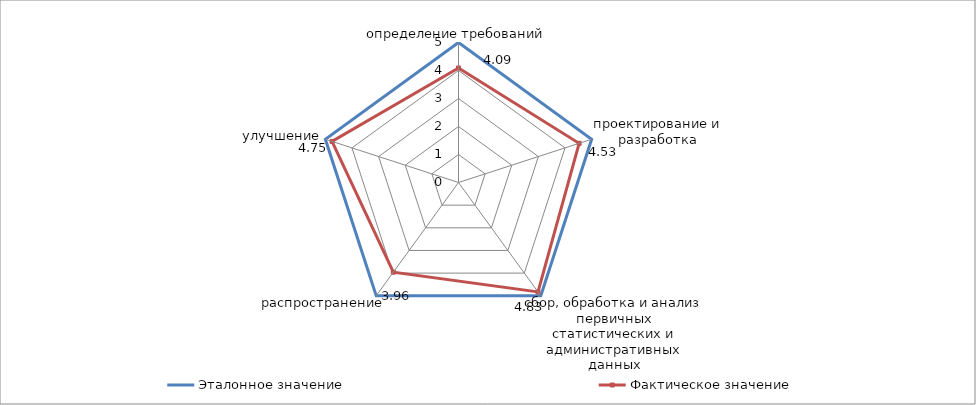
| Category | Эталонное значение | Фактическое значение |
|---|---|---|
| определение требований | 5 | 4.09 |
| проектирование и разработка | 5 | 4.53 |
| сбор, обработка и анализ первичных статистических и административных данных | 5 | 4.83 |
| распространение | 5 | 3.96 |
| улучшение | 5 | 4.75 |